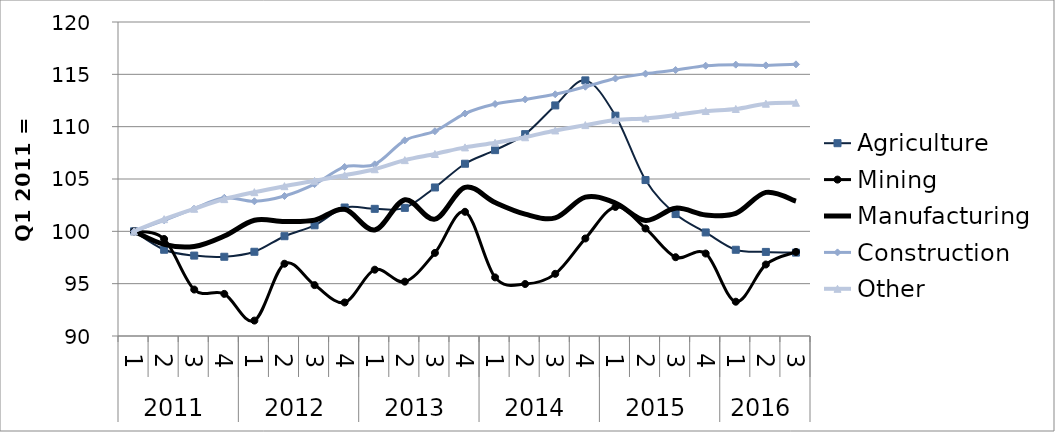
| Category | Agriculture | Mining | Manufacturing | Construction | Other |
|---|---|---|---|---|---|
| 0 | 100 | 100 | 100 | 100 | 100 |
| 1 | 98.24 | 99.268 | 98.753 | 101.06 | 101.162 |
| 2 | 97.682 | 94.437 | 98.552 | 102.172 | 102.155 |
| 3 | 97.57 | 94.023 | 99.553 | 103.206 | 103.076 |
| 4 | 98.048 | 91.473 | 101.063 | 102.872 | 103.743 |
| 5 | 99.534 | 96.902 | 100.94 | 103.373 | 104.315 |
| 6 | 100.575 | 94.863 | 101.071 | 104.51 | 104.825 |
| 7 | 102.276 | 93.203 | 102.103 | 106.155 | 105.355 |
| 8 | 102.149 | 96.335 | 100.124 | 106.4 | 105.932 |
| 9 | 102.243 | 95.193 | 103.016 | 108.692 | 106.805 |
| 10 | 104.191 | 97.939 | 101.166 | 109.565 | 107.389 |
| 11 | 106.459 | 101.867 | 104.206 | 111.255 | 108.019 |
| 12 | 107.759 | 95.598 | 102.752 | 112.168 | 108.462 |
| 13 | 109.285 | 94.966 | 101.644 | 112.605 | 108.988 |
| 14 | 112.031 | 95.94 | 101.288 | 113.093 | 109.64 |
| 15 | 114.421 | 99.317 | 103.264 | 113.817 | 110.149 |
| 16 | 111.05 | 102.33 | 102.706 | 114.6 | 110.631 |
| 17 | 104.9 | 100.274 | 101.044 | 115.061 | 110.789 |
| 18 | 101.649 | 97.527 | 102.213 | 115.412 | 111.116 |
| 19 | 99.893 | 97.878 | 101.57 | 115.824 | 111.495 |
| 20 | 98.238 | 93.276 | 101.715 | 115.926 | 111.691 |
| 21 | 98.034 | 96.832 | 103.717 | 115.856 | 112.193 |
| 22 | 97.966 | 98.033 | 102.889 | 115.956 | 112.289 |